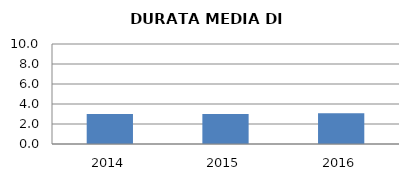
| Category | 2014 2015 2016 |
|---|---|
| 2014.0 | 3 |
| 2015.0 | 3 |
| 2016.0 | 3.071 |